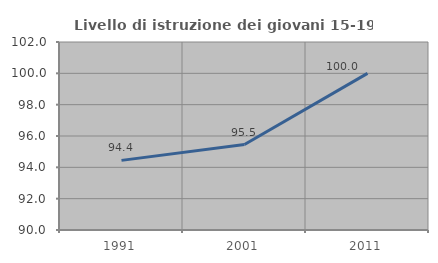
| Category | Livello di istruzione dei giovani 15-19 anni |
|---|---|
| 1991.0 | 94.444 |
| 2001.0 | 95.455 |
| 2011.0 | 100 |